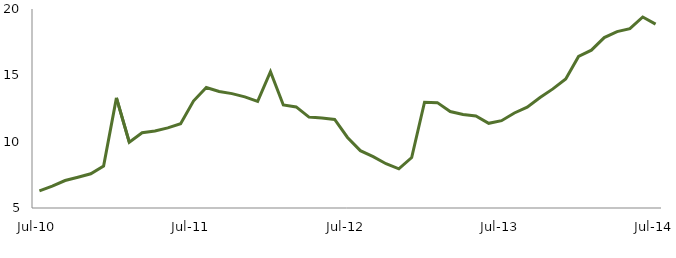
| Category | Series 0 |
|---|---|
| Jul-10 | 6.294 |
|  | 6.648 |
|  | 7.07 |
|  | 7.319 |
|  | 7.58 |
|  | 8.163 |
|  | 13.299 |
|  | 9.962 |
|  | 10.668 |
|  | 10.801 |
|  | 11.043 |
|  | 11.347 |
| Jul-11 | 13.063 |
|  | 14.083 |
|  | 13.787 |
|  | 13.621 |
|  | 13.374 |
|  | 13.036 |
|  | 15.271 |
|  | 12.765 |
|  | 12.617 |
|  | 11.855 |
|  | 11.781 |
|  | 11.679 |
| Jul-12 | 10.318 |
|  | 9.321 |
|  | 8.873 |
|  | 8.337 |
|  | 7.949 |
|  | 8.805 |
|  | 12.972 |
|  | 12.942 |
|  | 12.269 |
|  | 12.044 |
|  | 11.937 |
|  | 11.385 |
| Jul-13 | 11.582 |
|  | 12.163 |
|  | 12.602 |
|  | 13.328 |
|  | 13.977 |
|  | 14.732 |
|  | 16.419 |
|  | 16.896 |
|  | 17.846 |
|  | 18.295 |
|  | 18.518 |
|  | 19.397 |
| Jul-14 | 18.858 |